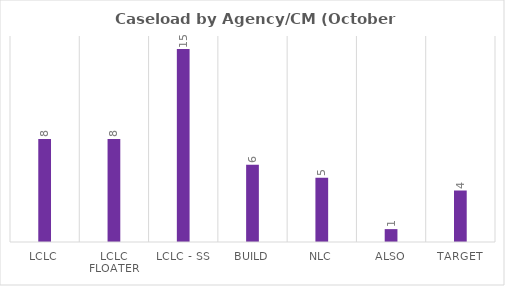
| Category | Series 0 |
|---|---|
| LCLC | 8 |
| LCLC Floater | 8 |
| LCLC - SS | 15 |
| BUILD | 6 |
| NLC | 5 |
| ALSO | 1 |
| Target | 4 |